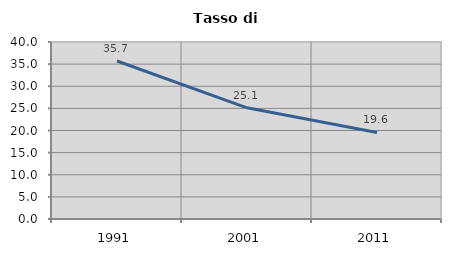
| Category | Tasso di disoccupazione   |
|---|---|
| 1991.0 | 35.714 |
| 2001.0 | 25.13 |
| 2011.0 | 19.554 |